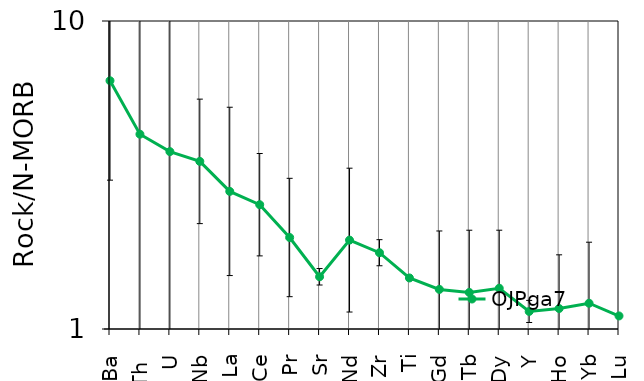
| Category | OJPga7 |
|---|---|
| Ba | 6.398 |
| Th  | 4.29 |
| U | 3.766 |
| Nb | 3.501 |
| La | 2.797 |
| Ce | 2.533 |
| Pr | 1.982 |
| Sr | 1.478 |
| Nd | 1.944 |
| Zr | 1.769 |
| Ti | 1.465 |
| Gd | 1.344 |
| Tb | 1.314 |
| Dy | 1.356 |
| Y | 1.14 |
| Ho | 1.165 |
| Yb | 1.212 |
| Lu | 1.102 |